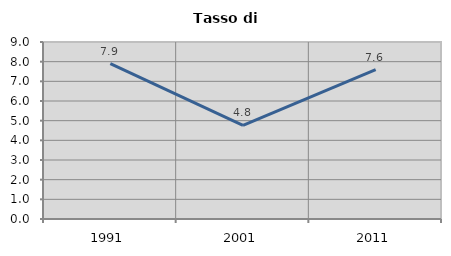
| Category | Tasso di disoccupazione   |
|---|---|
| 1991.0 | 7.897 |
| 2001.0 | 4.759 |
| 2011.0 | 7.599 |